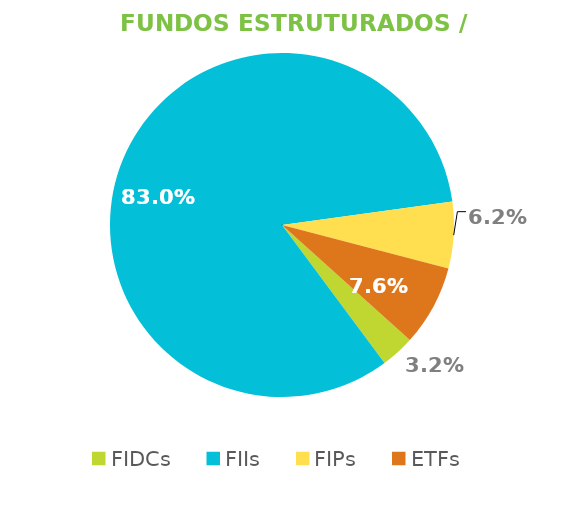
| Category | Fundos Estruturados / ETFs |
|---|---|
| FIDCs | 0.032 |
| FIIs | 0.83 |
| FIPs | 0.062 |
| ETFs | 0.076 |